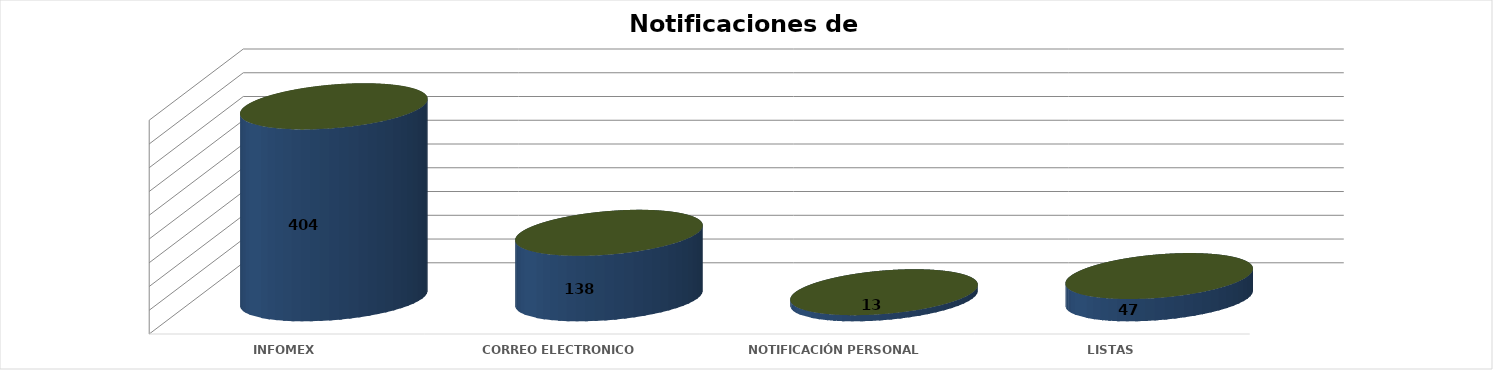
| Category | Series 0 | Series 1 | Series 2 | Series 3 | Series 4 |
|---|---|---|---|---|---|
| INFOMEX |  |  |  | 404 | 0.671 |
| CORREO ELECTRONICO |  |  |  | 138 | 0.229 |
| NOTIFICACIÓN PERSONAL |  |  |  | 13 | 0.022 |
| LISTAS |  |  |  | 47 | 0.078 |